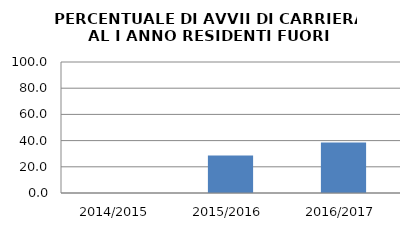
| Category | 2014/2015 2015/2016 2016/2017 |
|---|---|
| 2014/2015 | 0 |
| 2015/2016 | 28.571 |
| 2016/2017 | 38.462 |